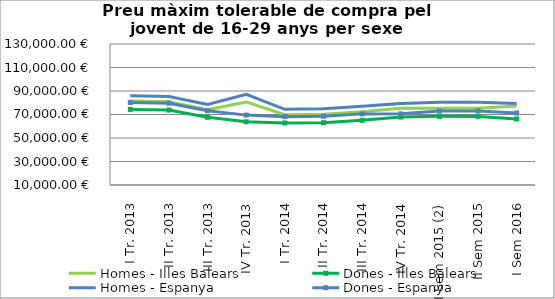
| Category | Homes - Illes Balears | Dones - Illes Balears | Homes - Espanya | Dones - Espanya |
|---|---|---|---|---|
| I Tr. 2013 | 81455.91 | 74342.69 | 86010.98 | 80209.66 |
| II Tr. 2013 | 80838.39 | 73779.1 | 85358.93 | 79601.59 |
| III Tr. 2013 | 74125.73 | 67652.63 | 78509.56 | 73214.2 |
| IV Tr. 2013 | 80681.54 | 63824.47 | 87120.57 | 69471.78 |
| I Tr. 2014 | 69817.73 | 62792.35 | 74441.16 | 68185.44 |
| II Tr. 2014 | 70114.06 | 63058.87 | 74820.39 | 68532.8 |
| III Tr. 2014 | 72282.3 | 65008.93 | 77002.57 | 70531.6 |
| IV Tr. 2014 | 75383.49 | 67823.23 | 79412.45 | 70560.02 |
| I Sem 2015 (2) | 75397.86 | 68427.28 | 80378.72 | 72947.67 |
| II Sem 2015 | 75362 | 68394.74 | 80419.37 | 72984.56 |
| I Sem 2016 | 77270.5 | 66235.15 | 79443.9 | 71295.92 |